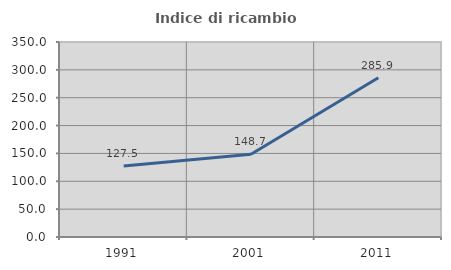
| Category | Indice di ricambio occupazionale  |
|---|---|
| 1991.0 | 127.5 |
| 2001.0 | 148.684 |
| 2011.0 | 285.938 |